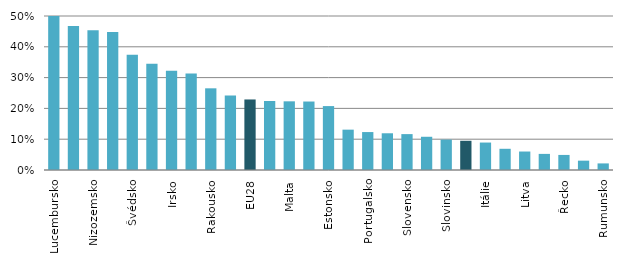
| Category | Value |
|---|---|
| Lucembursko | 0.519 |
| Dánsko | 0.468 |
| Nizozemsko | 0.453 |
| Velká Británie | 0.448 |
| Švédsko | 0.374 |
| Finsko | 0.345 |
| Irsko | 0.322 |
| Německo | 0.313 |
| Rakousko | 0.265 |
| Španělsko | 0.242 |
| EU28 | 0.229 |
| Belgie | 0.224 |
| Malta | 0.223 |
| Francie | 0.222 |
| Estonsko | 0.208 |
| Maďarsko | 0.131 |
| Portugalsko | 0.123 |
| Kypr | 0.119 |
| Slovensko | 0.117 |
| Lotyšsko | 0.108 |
| Slovinsko | 0.099 |
| Česko | 0.095 |
| Itálie | 0.089 |
| Chorvatsko | 0.069 |
| Litva | 0.06 |
| Polsko | 0.052 |
| Řecko | 0.049 |
| Bulharsko | 0.03 |
| Rumunsko | 0.021 |